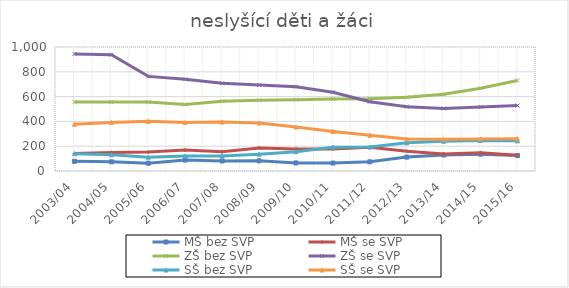
| Category | MŠ bez SVP | MŠ se SVP | ZŠ bez SVP | ZŠ se SVP | SŠ bez SVP | SŠ se SVP |
|---|---|---|---|---|---|---|
| 2003/04 | 78 | 141 | 557 | 944 | 139 | 377 |
| 2004/05 | 74 | 149 | 556 | 937 | 131 | 392 |
| 2005/06 | 63 | 153 | 556 | 763 | 111 | 401 |
| 2006/07 | 88 | 170 | 537 | 739 | 121 | 392 |
| 2007/08 | 81 | 155 | 563 | 708 | 121 | 395 |
| 2008/09 | 82 | 186 | 570 | 694 | 136 | 387 |
| 2009/10 | 65 | 178 | 575 | 680 | 156 | 355 |
| 2010/11 | 64 | 178 | 581 | 635 | 192 | 319 |
| 2011/12 | 74 | 192 | 582 | 559 | 193 | 289 |
| 2012/13 | 112 | 160 | 594 | 519 | 228 | 258 |
| 2013/14 | 129 | 137 | 619 | 504 | 240 | 257 |
| 2014/15 | 136 | 147 | 667 | 516 | 246 | 259 |
| 2015/16 | 124 | 127 | 730 | 528 | 243 | 261 |